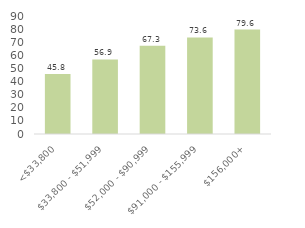
| Category | Series 0 |
|---|---|
| <$33,800 | 45.76 |
| $33,800 - $51,999 | 56.901 |
| $52,000 - $90,999 | 67.281 |
| $91,000 - $155,999 | 73.626 |
| $156,000+ | 79.64 |